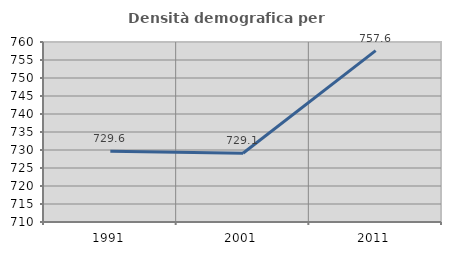
| Category | Densità demografica |
|---|---|
| 1991.0 | 729.636 |
| 2001.0 | 729.111 |
| 2011.0 | 757.598 |